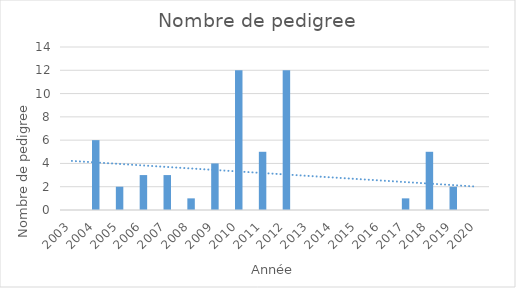
| Category | Series 0 |
|---|---|
| 2003.0 | 0 |
| 2004.0 | 6 |
| 2005.0 | 2 |
| 2006.0 | 3 |
| 2007.0 | 3 |
| 2008.0 | 1 |
| 2009.0 | 4 |
| 2010.0 | 12 |
| 2011.0 | 5 |
| 2012.0 | 12 |
| 2013.0 | 0 |
| 2014.0 | 0 |
| 2015.0 | 0 |
| 2016.0 | 0 |
| 2017.0 | 1 |
| 2018.0 | 5 |
| 2019.0 | 2 |
| 2020.0 | 0 |